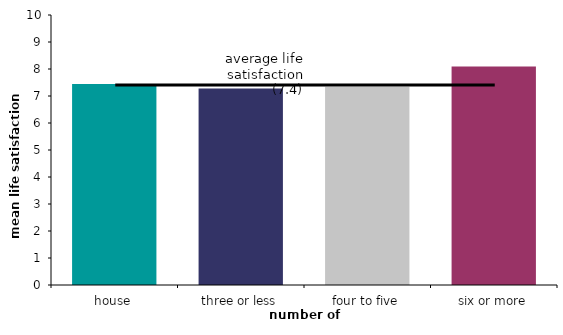
| Category | Series 0 |
|---|---|
| house | 7.443 |
| three or less | 7.276 |
| four to five | 7.341 |
| six or more | 8.089 |